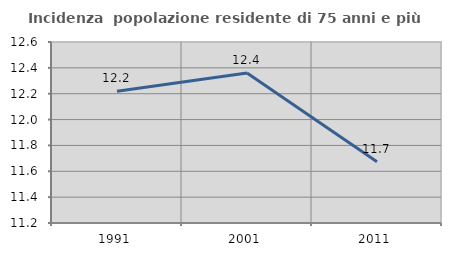
| Category | Incidenza  popolazione residente di 75 anni e più |
|---|---|
| 1991.0 | 12.219 |
| 2001.0 | 12.361 |
| 2011.0 | 11.675 |